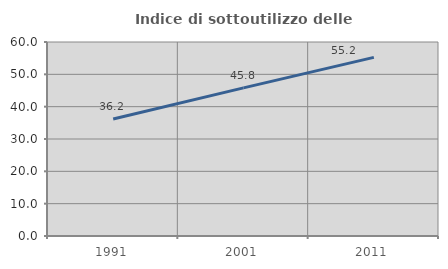
| Category | Indice di sottoutilizzo delle abitazioni  |
|---|---|
| 1991.0 | 36.163 |
| 2001.0 | 45.812 |
| 2011.0 | 55.25 |